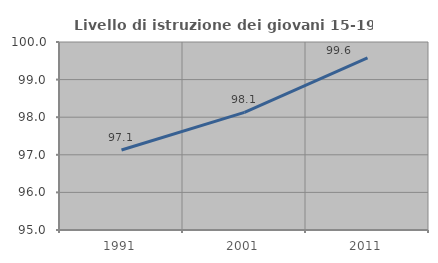
| Category | Livello di istruzione dei giovani 15-19 anni |
|---|---|
| 1991.0 | 97.128 |
| 2001.0 | 98.127 |
| 2011.0 | 99.578 |